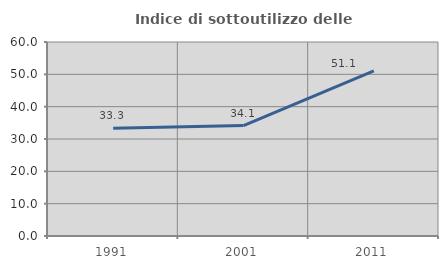
| Category | Indice di sottoutilizzo delle abitazioni  |
|---|---|
| 1991.0 | 33.333 |
| 2001.0 | 34.146 |
| 2011.0 | 51.064 |